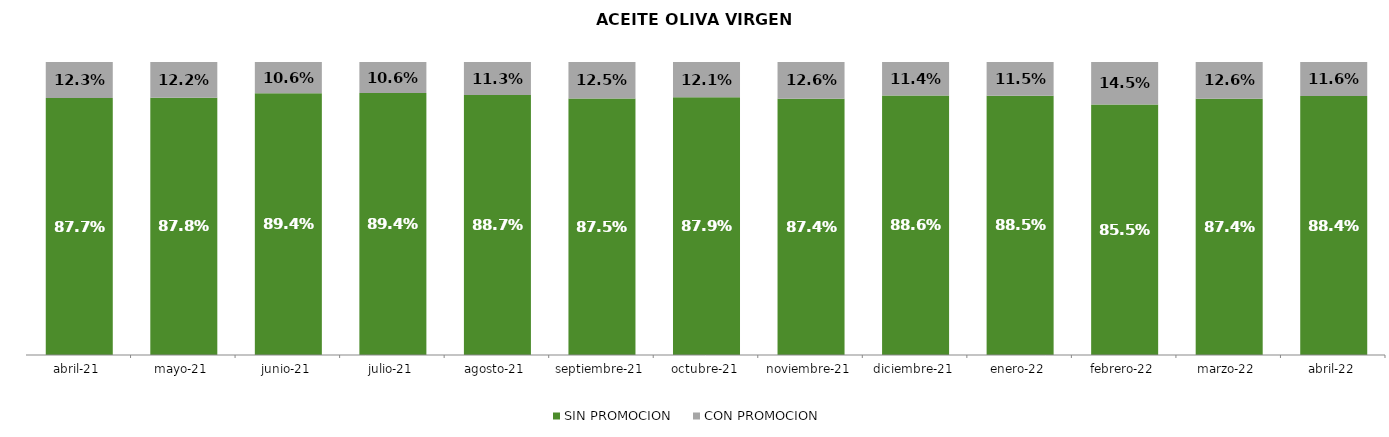
| Category | SIN PROMOCION   | CON PROMOCION   |
|---|---|---|
| 2021-04-01 | 0.877 | 0.123 |
| 2021-05-01 | 0.878 | 0.122 |
| 2021-06-01 | 0.894 | 0.106 |
| 2021-07-01 | 0.894 | 0.106 |
| 2021-08-01 | 0.887 | 0.113 |
| 2021-09-01 | 0.875 | 0.125 |
| 2021-10-01 | 0.879 | 0.121 |
| 2021-11-01 | 0.874 | 0.126 |
| 2021-12-01 | 0.886 | 0.114 |
| 2022-01-01 | 0.885 | 0.115 |
| 2022-02-01 | 0.855 | 0.145 |
| 2022-03-01 | 0.874 | 0.126 |
| 2022-04-01 | 0.884 | 0.116 |